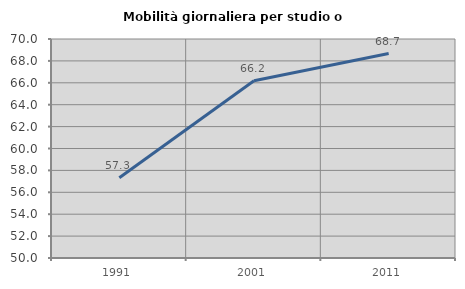
| Category | Mobilità giornaliera per studio o lavoro |
|---|---|
| 1991.0 | 57.323 |
| 2001.0 | 66.195 |
| 2011.0 | 68.675 |